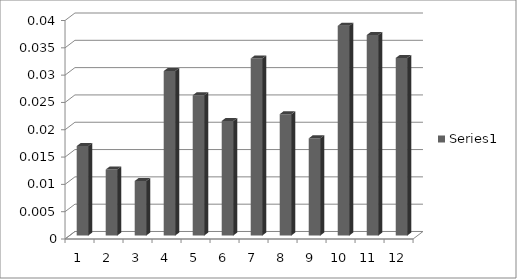
| Category | Series 0 |
|---|---|
| 0 | 0.016 |
| 1 | 0.012 |
| 2 | 0.01 |
| 3 | 0.03 |
| 4 | 0.026 |
| 5 | 0.021 |
| 6 | 0.032 |
| 7 | 0.022 |
| 8 | 0.018 |
| 9 | 0.038 |
| 10 | 0.037 |
| 11 | 0.033 |